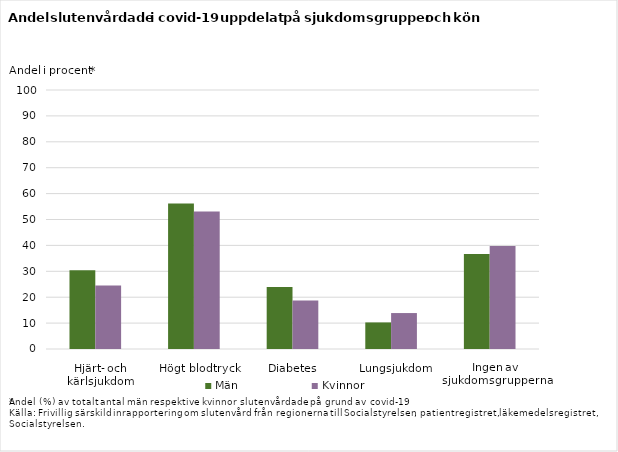
| Category | Män | Kvinnor |
|---|---|---|
| Hjärt- och kärlsjukdom | 30.412 | 24.518 |
| Högt blodtryck | 56.15 | 53.105 |
| Diabetes | 23.903 | 18.748 |
| Lungsjukdom | 10.264 | 13.879 |
| Ingen av sjukdomsgrupperna | 36.681 | 39.725 |